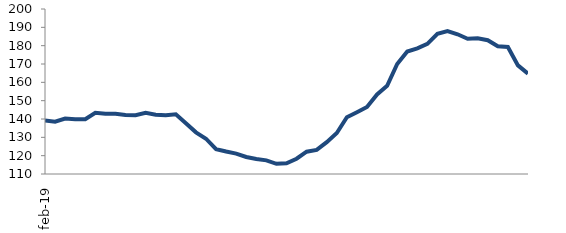
| Category | Series 1 |
|---|---|
| 2019-02-01 | 139.126 |
| 2019-03-01 | 138.572 |
| 2019-04-01 | 140.245 |
| 2019-05-01 | 139.837 |
| 2019-06-01 | 139.902 |
| 2019-07-01 | 143.407 |
| 2019-08-01 | 142.858 |
| 2019-09-01 | 142.851 |
| 2019-10-01 | 142.191 |
| 2019-11-01 | 142.033 |
| 2019-12-01 | 143.368 |
| 2020-01-01 | 142.304 |
| 2020-02-01 | 142.083 |
| 2020-03-01 | 142.55 |
| 2020-04-01 | 137.633 |
| 2020-05-01 | 132.724 |
| 2020-06-01 | 129.259 |
| 2020-07-01 | 123.596 |
| 2020-08-01 | 122.255 |
| 2020-09-01 | 121.144 |
| 2020-10-01 | 119.283 |
| 2020-11-01 | 118.161 |
| 2020-12-01 | 117.437 |
| 2021-01-01 | 115.578 |
| 2021-02-01 | 115.815 |
| 2021-03-01 | 118.336 |
| 2021-04-01 | 122.182 |
| 2021-05-01 | 123.161 |
| 2021-06-01 | 127.378 |
| 2021-07-01 | 132.379 |
| 2021-08-01 | 140.968 |
| 2021-09-01 | 143.714 |
| 2021-10-01 | 146.592 |
| 2021-11-01 | 153.358 |
| 2021-12-01 | 158.065 |
| 2022-01-01 | 169.996 |
| 2022-02-01 | 176.833 |
| 2022-03-01 | 178.555 |
| 2022-04-01 | 181.017 |
| 2022-05-01 | 186.486 |
| 2022-06-01 | 187.985 |
| 2022-07-01 | 186.205 |
| 2022-08-01 | 183.725 |
| 2022-09-01 | 184.03 |
| 2022-10-01 | 182.947 |
| 2022-11-01 | 179.704 |
| 2022-12-01 | 179.279 |
| 2023-01-01 | 169.264 |
| 2023-02-01 | 164.751 |